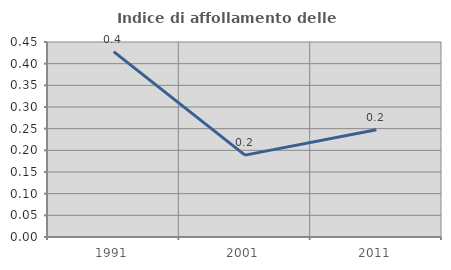
| Category | Indice di affollamento delle abitazioni  |
|---|---|
| 1991.0 | 0.428 |
| 2001.0 | 0.189 |
| 2011.0 | 0.248 |